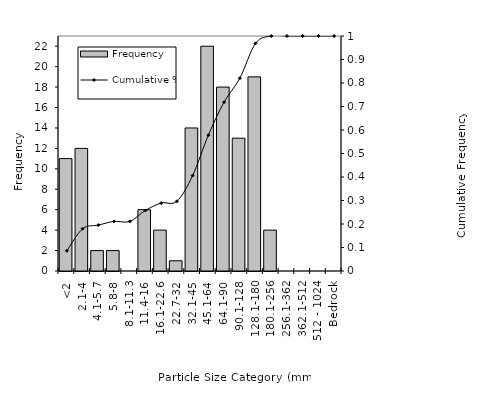
| Category | Frequency |
|---|---|
| <2 | 11 |
| 2.1-4 | 12 |
| 4.1-5.7 | 2 |
| 5.8-8 | 2 |
| 8.1-11.3 | 0 |
| 11.4-16 | 6 |
| 16.1-22.6 | 4 |
| 22.7-32 | 1 |
| 32.1-45 | 14 |
| 45.1-64 | 22 |
| 64.1-90 | 18 |
| 90.1-128 | 13 |
| 128.1-180 | 19 |
| 180.1-256 | 4 |
| 256.1-362 | 0 |
| 362.1-512 | 0 |
| 512 - 1024 | 0 |
| Bedrock | 0 |